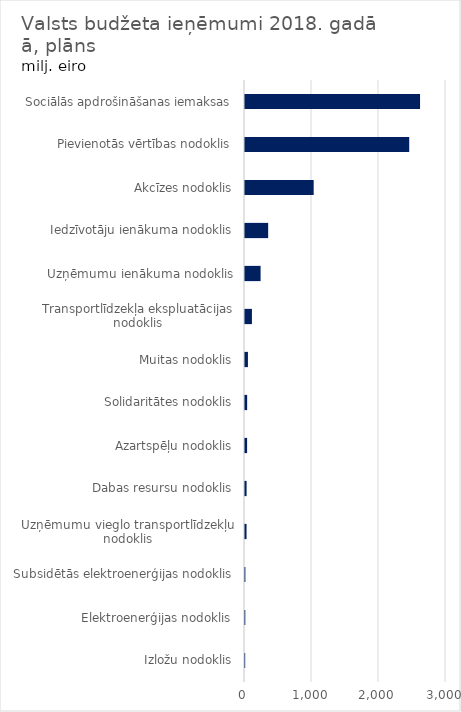
| Category | 2018 |
|---|---|
| Sociālās apdrošināšanas iemaksas | 2612.774 |
| Pievienotās vērtības nodoklis | 2451.139 |
| Akcīzes nodoklis | 1025.025 |
| Iedzīvotāju ienākuma nodoklis | 345.76 |
| Uzņēmumu ienākuma nodoklis | 232.7 |
| Transportlīdzekļa ekspluatācijas nodoklis | 103.5 |
| Muitas nodoklis | 43.8 |
| Solidaritātes nodoklis | 32.025 |
| Azartspēļu nodoklis | 31.28 |
| Dabas resursu nodoklis | 23.78 |
| Uzņēmumu vieglo transportlīdzekļu nodoklis | 23.1 |
| Subsidētās elektroenerģijas nodoklis | 5.803 |
| Elektroenerģijas nodoklis | 4.704 |
| Izložu nodoklis | 3 |